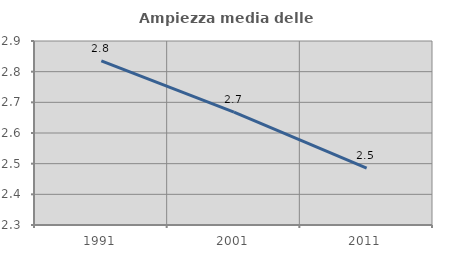
| Category | Ampiezza media delle famiglie |
|---|---|
| 1991.0 | 2.835 |
| 2001.0 | 2.668 |
| 2011.0 | 2.485 |